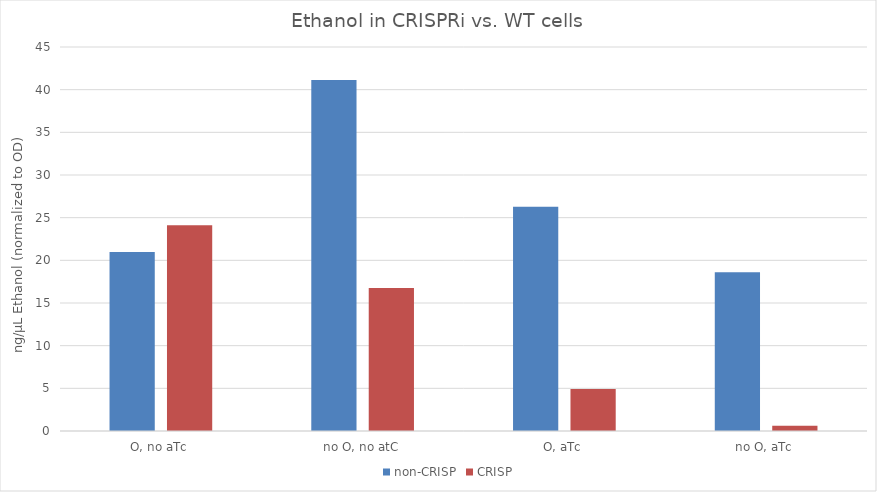
| Category | non-CRISP | CRISP |
|---|---|---|
| O, no aTc | 20.972 | 24.113 |
| no O, no atC | 41.133 | 16.748 |
| O, aTc | 26.291 | 4.926 |
| no O, aTc | 18.611 | 0.606 |